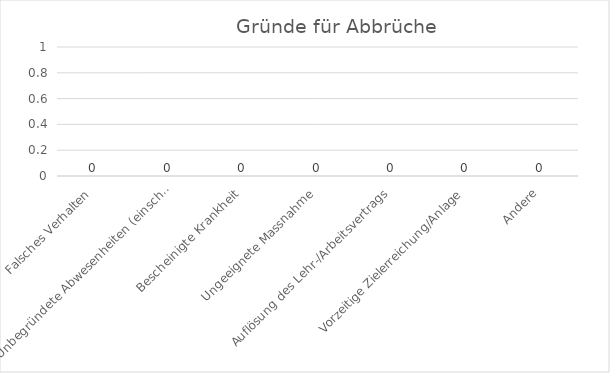
| Category | Series 0 |
|---|---|
| Falsches Verhalten | 0 |
| Unbegründete Abwesenheiten (einschließlich Krankheit ohne ärztliches Zeugnis) | 0 |
| Bescheinigte Krankheit | 0 |
| Ungeeignete Massnahme | 0 |
| Auflösung des Lehr-/Arbeitsvertrags | 0 |
| Vorzeitige Zielerreichung/Anlage | 0 |
| Andere | 0 |